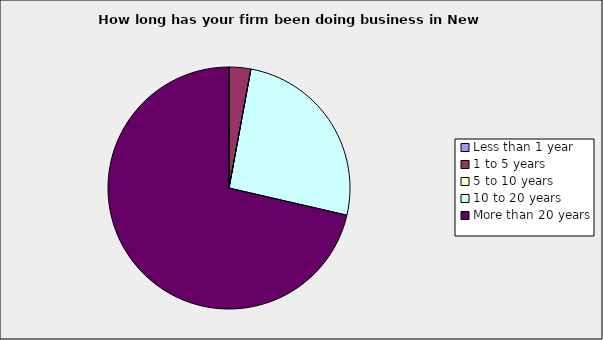
| Category | Series 0 |
|---|---|
| Less than 1 year | 0 |
| 1 to 5 years | 0.029 |
| 5 to 10 years | 0 |
| 10 to 20 years | 0.257 |
| More than 20 years | 0.714 |